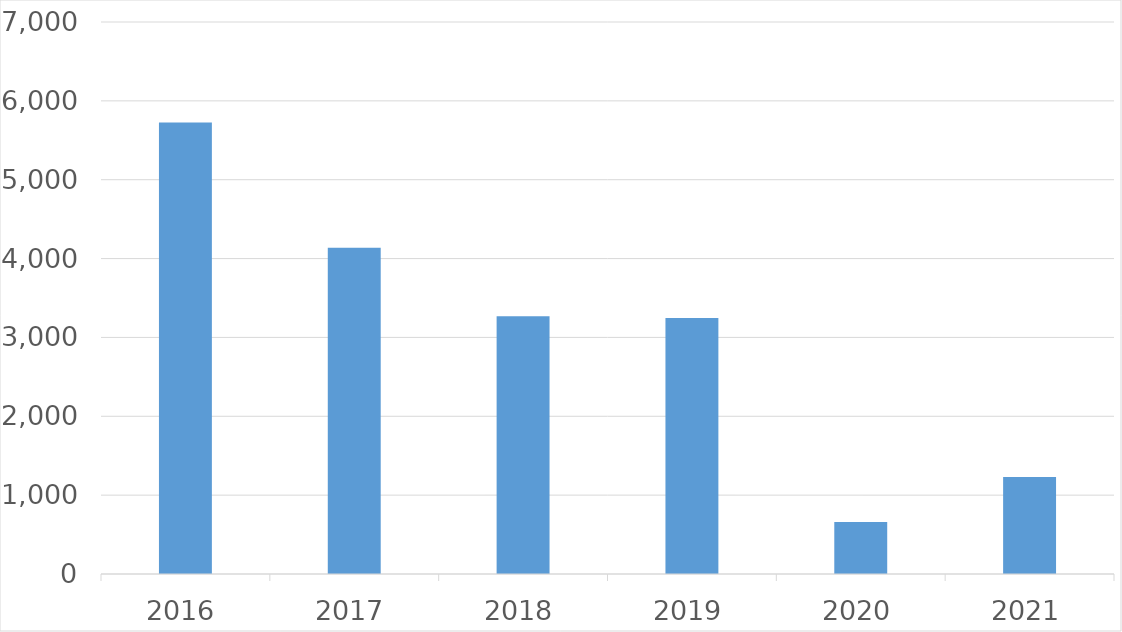
| Category | Series 0 |
|---|---|
| 2016 | 5725 |
| 2017 | 4138 |
| 2018 | 3267 |
| 2019 | 3245 |
| 2020 | 659 |
| 2021 | 1229 |